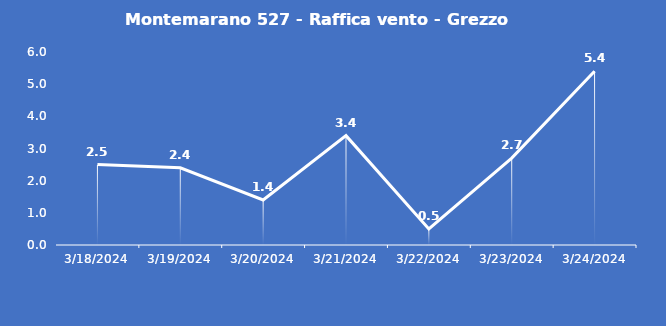
| Category | Montemarano 527 - Raffica vento - Grezzo (m/s) |
|---|---|
| 3/18/24 | 2.5 |
| 3/19/24 | 2.4 |
| 3/20/24 | 1.4 |
| 3/21/24 | 3.4 |
| 3/22/24 | 0.5 |
| 3/23/24 | 2.7 |
| 3/24/24 | 5.4 |